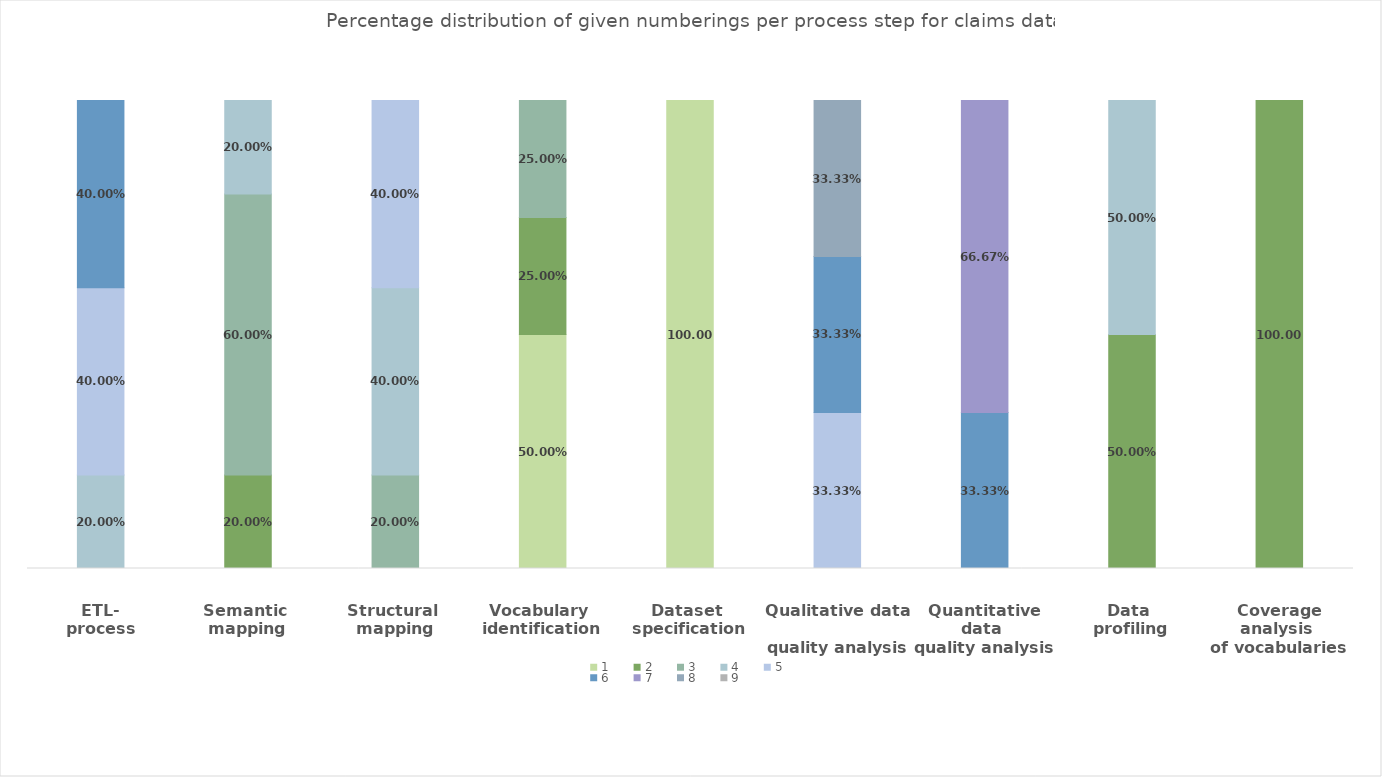
| Category | 1 | 2 | 3 | 4 | 5 | 6 | 7 | 8 | 9 |
|---|---|---|---|---|---|---|---|---|---|
| ETL-
process | 0 | 0 | 0 | 0.2 | 0.4 | 0.4 | 0 | 0 | 0 |
| Semantic 
mapping | 0 | 0.2 | 0.6 | 0.2 | 0 | 0 | 0 | 0 | 0 |
| Structural 
mapping | 0 | 0 | 0.2 | 0.4 | 0.4 | 0 | 0 | 0 | 0 |
| Vocabulary 
identification | 0.5 | 0.25 | 0.25 | 0 | 0 | 0 | 0 | 0 | 0 |
| Dataset 
specification | 1 | 0 | 0 | 0 | 0 | 0 | 0 | 0 | 0 |
| Qualitative data 
quality analysis | 0 | 0 | 0 | 0 | 0.333 | 0.333 | 0 | 0.333 | 0 |
| Quantitative data 
quality analysis | 0 | 0 | 0 | 0 | 0 | 0.333 | 0.667 | 0 | 0 |
| Data 
profiling | 0 | 0.5 | 0 | 0.5 | 0 | 0 | 0 | 0 | 0 |
| Coverage analysis 
of vocabularies | 0 | 1 | 0 | 0 | 0 | 0 | 0 | 0 | 0 |